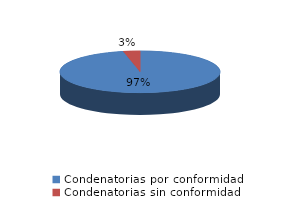
| Category | Series 0 |
|---|---|
| 0 | 114 |
| 1 | 4 |